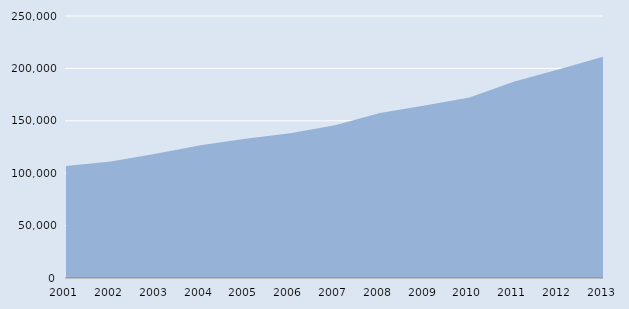
| Category | Series 0 |
|---|---|
| 2001.0 | 106828 |
| 2002.0 | 111106 |
| 2003.0 | 118521 |
| 2004.0 | 126789 |
| 2005.0 | 132872 |
| 2006.0 | 138065 |
| 2007.0 | 145736 |
| 2008.0 | 157455 |
| 2009.0 | 164691 |
| 2010.0 | 172274 |
| 2011.0 | 187409 |
| 2012.0 | 199209 |
| 2013.0 | 211451 |